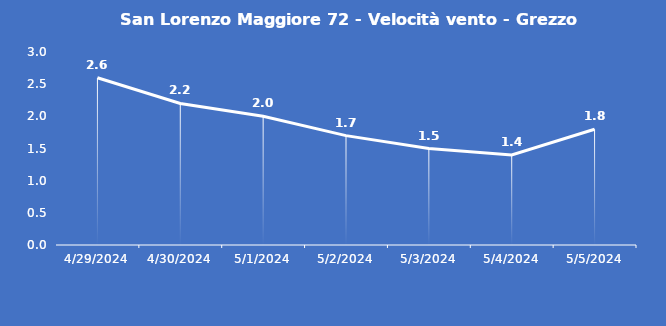
| Category | San Lorenzo Maggiore 72 - Velocità vento - Grezzo (m/s) |
|---|---|
| 4/29/24 | 2.6 |
| 4/30/24 | 2.2 |
| 5/1/24 | 2 |
| 5/2/24 | 1.7 |
| 5/3/24 | 1.5 |
| 5/4/24 | 1.4 |
| 5/5/24 | 1.8 |